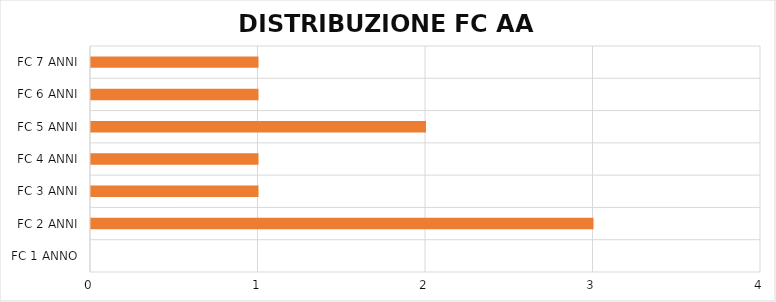
| Category | Series 0 |
|---|---|
| FC 1 ANNO | 0 |
| FC 2 ANNI | 3 |
| FC 3 ANNI | 1 |
| FC 4 ANNI | 1 |
| FC 5 ANNI | 2 |
| FC 6 ANNI | 1 |
| FC 7 ANNI | 1 |